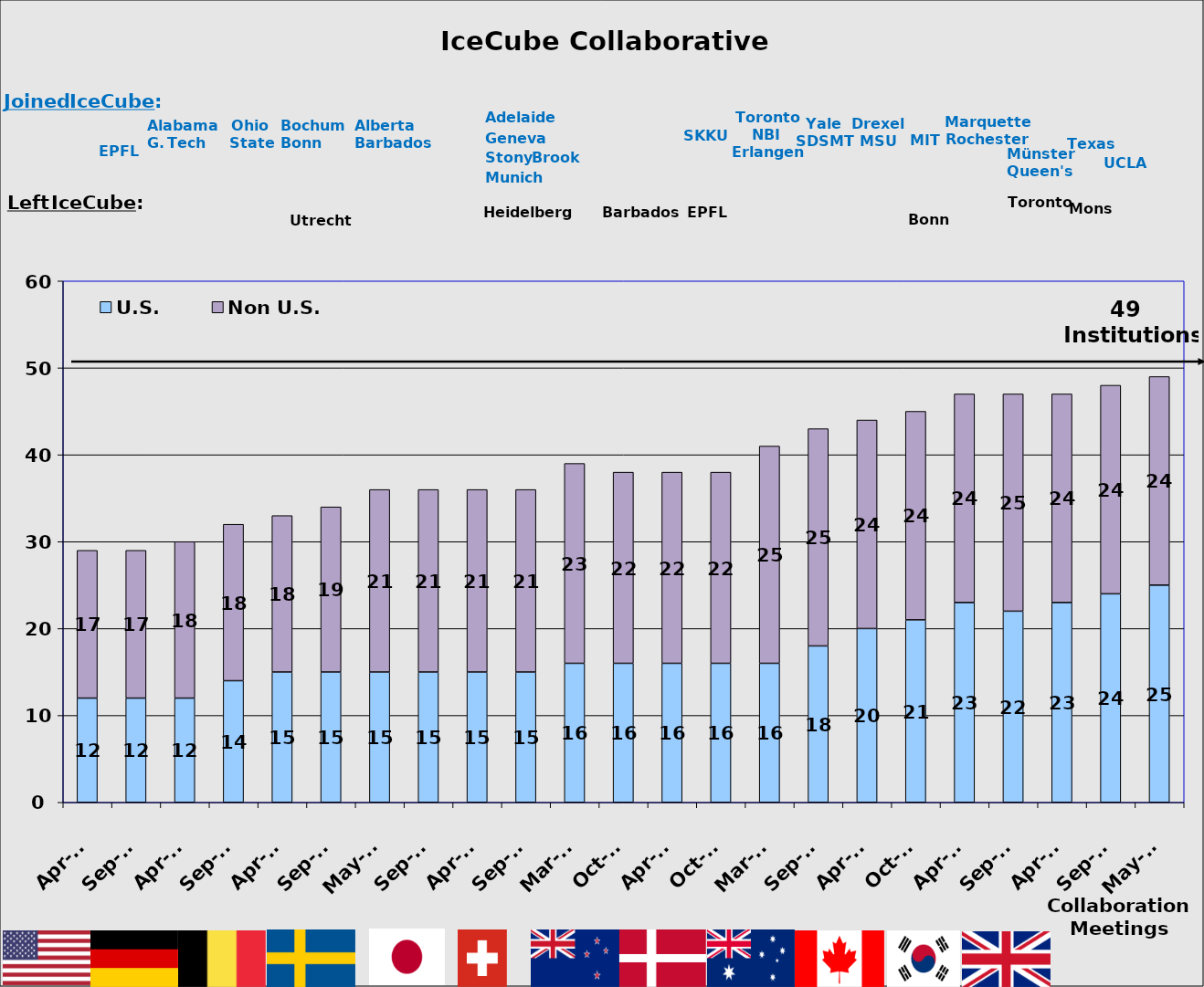
| Category | U.S. | Non U.S. |
|---|---|---|
| Apr-07 | 12 | 17 |
| Sep-07 | 12 | 17 |
| Apr-08 | 12 | 18 |
| Sep-08 | 14 | 18 |
| Apr-09 | 15 | 18 |
| Sep-09 | 15 | 19 |
| May-10 | 15 | 21 |
| Sep-10 | 15 | 21 |
| Apr-11 | 15 | 21 |
| Sep-11 | 15 | 21 |
| Mar-12 | 16 | 23 |
| Oct-12 | 16 | 22 |
| Apr-13 | 16 | 22 |
| Oct-13 | 16 | 22 |
| Mar-14 | 16 | 25 |
| Sep-14 | 18 | 25 |
| Apr-15 | 20 | 24 |
| Oct-15 | 21 | 24 |
| Apr-16 | 23 | 24 |
| Sep-16 | 22 | 25 |
| Apr-17 | 23 | 24 |
| Sep-17 | 24 | 24 |
| May-18 | 25 | 24 |